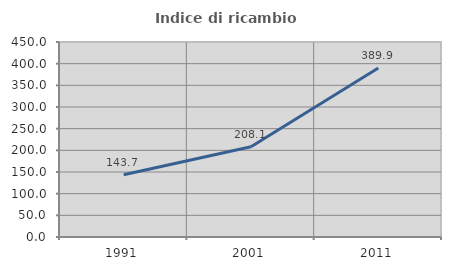
| Category | Indice di ricambio occupazionale  |
|---|---|
| 1991.0 | 143.689 |
| 2001.0 | 208.108 |
| 2011.0 | 389.87 |